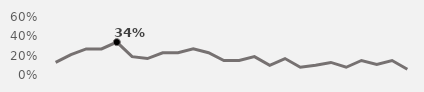
| Category | Thursday |
|---|---|
| 1994.0 | 0.13 |
| 1995.0 | 0.21 |
| 1996.0 | 0.27 |
| 1997.0 | 0.27 |
| 1998.0 | 0.34 |
| 1999.0 | 0.19 |
| 2000.0 | 0.17 |
| 2001.0 | 0.23 |
| 2002.0 | 0.23 |
| 2003.0 | 0.27 |
| 2004.0 | 0.23 |
| 2005.0 | 0.15 |
| 2006.0 | 0.15 |
| 2007.0 | 0.19 |
| 2008.0 | 0.1 |
| 2009.0 | 0.17 |
| 2010.0 | 0.08 |
| 2011.0 | 0.1 |
| 2012.0 | 0.13 |
| 2013.0 | 0.08 |
| 2014.0 | 0.15 |
| 2015.0 | 0.11 |
| 2016.0 | 0.15 |
| 2017.0 | 0.06 |